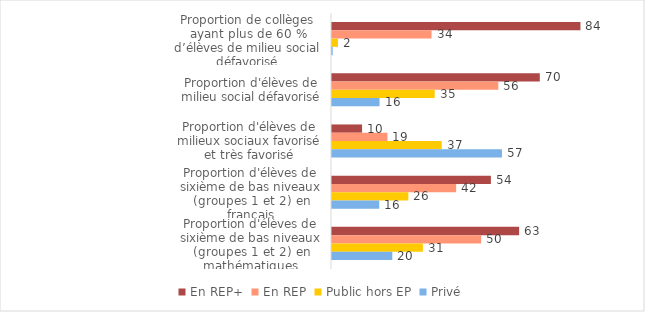
| Category | En REP+ | En REP | Public hors EP | Privé |
|---|---|---|---|---|
| Proportion de collèges ayant plus de 60 % d’élèves de milieu social défavorisé | 83.657 | 33.516 | 2.012 | 0.241 |
| Proportion d'élèves de milieu social défavorisé | 69.967 | 55.989 | 34.578 | 16.011 |
| Proportion d'élèves de milieux sociaux favorisé et très favorisé | 10.122 | 18.667 | 36.956 | 57.218 |
| Proportion d'élèves de sixième de bas niveaux (groupes 1 et 2) en français | 53.5 | 41.8 | 25.7 | 15.9 |
| Proportion d'élèves de sixième de bas niveaux (groupes 1 et 2) en mathématiques | 63 | 50.2 | 30.6 | 20.3 |